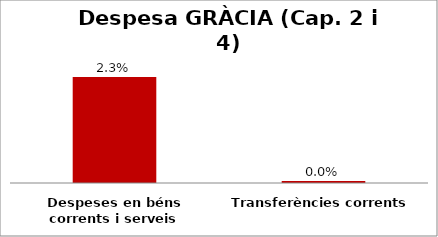
| Category | Series 0 |
|---|---|
| Despeses en béns corrents i serveis | 0.023 |
| Transferències corrents | 0 |